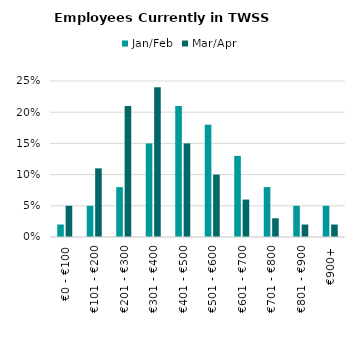
| Category | Jan/Feb | Mar/Apr |
|---|---|---|
| €0 - €100 | 0.02 | 0.05 |
| €101 - €200 | 0.05 | 0.11 |
| €201 - €300 | 0.08 | 0.21 |
| €301 - €400 | 0.15 | 0.24 |
| €401 - €500 | 0.21 | 0.15 |
| €501 - €600 | 0.18 | 0.1 |
| €601 - €700 | 0.13 | 0.06 |
| €701 - €800 | 0.08 | 0.03 |
| €801 - €900 | 0.05 | 0.02 |
| €900+ | 0.05 | 0.02 |